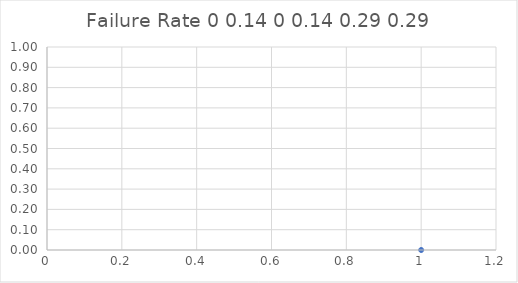
| Category | Failure Rate |
|---|---|
| 0 | 0 |